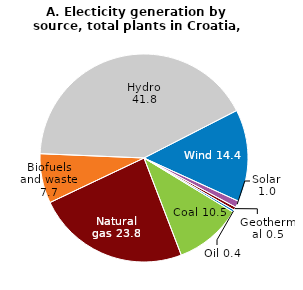
| Category | 2022 |
|---|---|
| Oil | 0.354 |
| Coal | 10.478 |
| Natural gas | 23.791 |
| Biofuels and waste | 7.703 |
| Hydro | 41.807 |
| Wind | 14.358 |
| Solar | 1.02 |
| Geothermal | 0.488 |